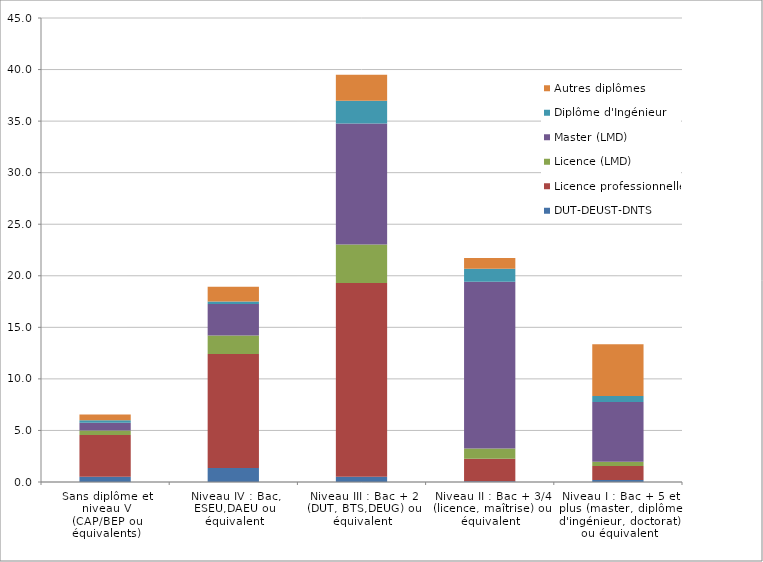
| Category | DUT-DEUST-DNTS | Licence professionnelle | Licence (LMD) | Master (LMD) | Diplôme d'Ingénieur | Autres diplômes |
|---|---|---|---|---|---|---|
| Sans diplôme et niveau V
(CAP/BEP ou équivalents) | 0.512 | 4.041 | 0.435 | 0.767 | 0.23 | 0.563 |
| Niveau IV : Bac, ESEU,DAEU ou équivalent | 1.355 | 11.049 | 1.816 | 3.043 | 0.23 | 1.432 |
| Niveau III : Bac + 2 (DUT, BTS,DEUG) ou équivalent | 0.512 | 18.798 | 3.734 | 11.714 | 2.225 | 2.506 |
| Niveau II : Bac + 3/4 (licence, maîtrise) ou équivalent | 0.077 | 2.174 | 0.997 | 16.164 | 1.279 | 1.023 |
| Niveau I : Bac + 5 et plus (master, diplôme d'ingénieur, doctorat) ou équivalent | 0.205 | 1.355 | 0.409 | 5.78 | 0.588 | 5.013 |